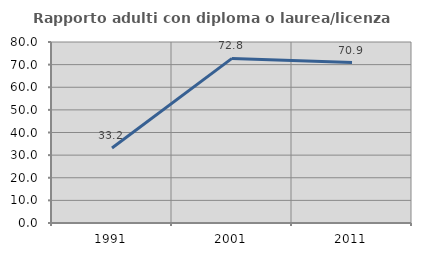
| Category | Rapporto adulti con diploma o laurea/licenza media  |
|---|---|
| 1991.0 | 33.18 |
| 2001.0 | 72.756 |
| 2011.0 | 70.913 |